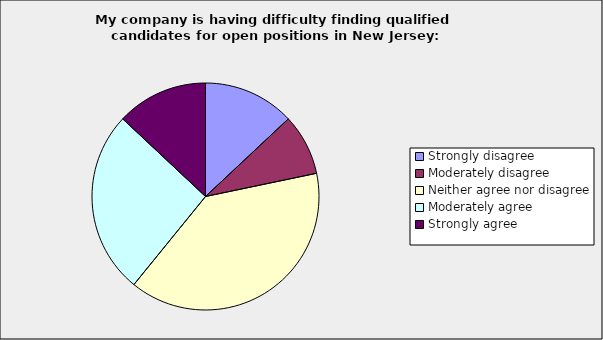
| Category | Series 0 |
|---|---|
| Strongly disagree | 0.13 |
| Moderately disagree | 0.087 |
| Neither agree nor disagree | 0.391 |
| Moderately agree | 0.261 |
| Strongly agree | 0.13 |